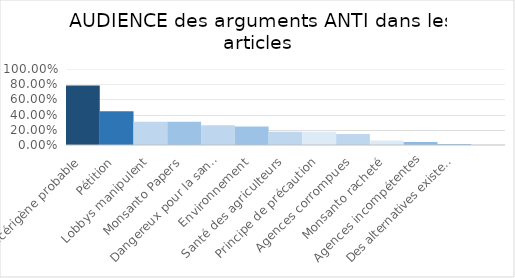
| Category | Series 0 |
|---|---|
| Cancérigène probable | 0.782 |
| Pétition | 0.443 |
| Lobbys manipulent | 0.307 |
| Monsanto Papers | 0.306 |
| Dangereux pour la santé | 0.259 |
| Environnement | 0.245 |
| Santé des agriculteurs | 0.174 |
| Principe de précaution | 0.174 |
| Agences corrompues | 0.146 |
| Monsanto racheté | 0.059 |
| Agences incompétentes | 0.041 |
| Des alternatives existent  | 0.012 |